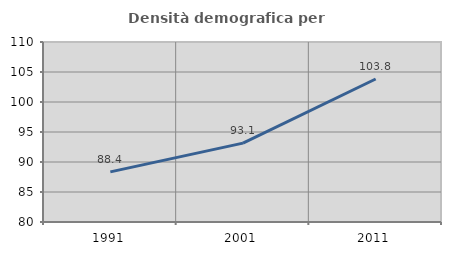
| Category | Densità demografica |
|---|---|
| 1991.0 | 88.358 |
| 2001.0 | 93.145 |
| 2011.0 | 103.832 |